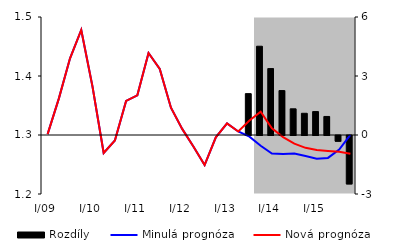
| Category | Rozdíly |
|---|---|
| 0 | 0 |
| 1 | 0 |
| 2 | 0 |
| 3 | 0 |
| 4 | 0 |
| 5 | 0 |
| 6 | 0 |
| 7 | 0 |
| 8 | 0 |
| 9 | 0 |
| 10 | 0 |
| 11 | 0 |
| 12 | 0 |
| 13 | 0 |
| 14 | 0 |
| 15 | 0 |
| 16 | 0 |
| 17 | 0 |
| 18 | 2.104 |
| 19 | 4.514 |
| 20 | 3.377 |
| 21 | 2.259 |
| 22 | 1.332 |
| 23 | 1.104 |
| 24 | 1.191 |
| 25 | 0.943 |
| 26 | -0.291 |
| 27 | -2.462 |